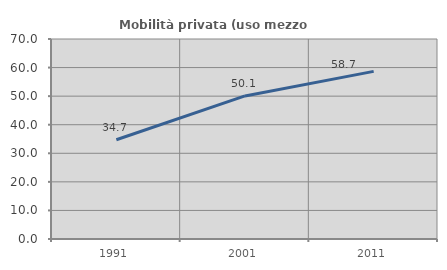
| Category | Mobilità privata (uso mezzo privato) |
|---|---|
| 1991.0 | 34.731 |
| 2001.0 | 50.07 |
| 2011.0 | 58.671 |